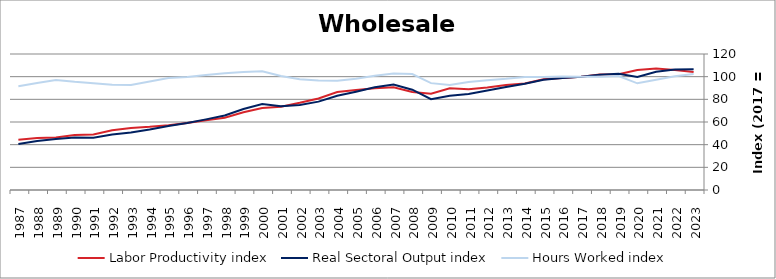
| Category | Labor Productivity index | Real Sectoral Output index | Hours Worked index |
|---|---|---|---|
| 2023.0 | 104.15 | 106.653 | 102.404 |
| 2022.0 | 105.891 | 106.251 | 100.341 |
| 2021.0 | 107.225 | 104.257 | 97.232 |
| 2020.0 | 105.891 | 99.661 | 94.117 |
| 2019.0 | 102.071 | 102.56 | 100.479 |
| 2018.0 | 101.892 | 101.799 | 99.909 |
| 2017.0 | 100 | 100 | 100 |
| 2016.0 | 98.762 | 98.821 | 100.06 |
| 2015.0 | 97.644 | 97.307 | 99.655 |
| 2014.0 | 93.99 | 93.802 | 99.8 |
| 2013.0 | 92.601 | 90.803 | 98.058 |
| 2012.0 | 90.544 | 87.72 | 96.881 |
| 2011.0 | 88.894 | 84.73 | 95.316 |
| 2010.0 | 89.84 | 83.159 | 92.564 |
| 2009.0 | 84.944 | 80.094 | 94.291 |
| 2008.0 | 86.555 | 88.503 | 102.25 |
| 2007.0 | 90.557 | 93.022 | 102.722 |
| 2006.0 | 89.85 | 90.605 | 100.841 |
| 2005.0 | 88.288 | 86.727 | 98.232 |
| 2004.0 | 86.382 | 83.216 | 96.335 |
| 2003.0 | 80.757 | 77.97 | 96.549 |
| 2002.0 | 76.915 | 75.091 | 97.628 |
| 2001.0 | 73.506 | 73.936 | 100.584 |
| 2000.0 | 72.373 | 75.879 | 104.844 |
| 1999.0 | 68.618 | 71.45 | 104.128 |
| 1998.0 | 63.741 | 65.694 | 103.065 |
| 1997.0 | 61.468 | 62.323 | 101.392 |
| 1996.0 | 59.214 | 59.068 | 99.754 |
| 1995.0 | 57.229 | 56.539 | 98.794 |
| 1994.0 | 55.743 | 53.373 | 95.748 |
| 1993.0 | 54.659 | 50.65 | 92.666 |
| 1992.0 | 52.768 | 48.996 | 92.852 |
| 1991.0 | 48.935 | 46.113 | 94.233 |
| 1990.0 | 48.501 | 46.274 | 95.41 |
| 1989.0 | 46.297 | 44.937 | 97.063 |
| 1988.0 | 45.776 | 43.248 | 94.478 |
| 1987.0 | 44.354 | 40.577 | 91.484 |